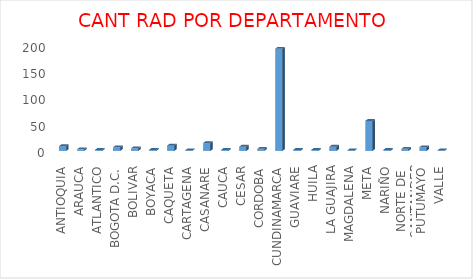
| Category | Series 0 |
|---|---|
| ANTIOQUIA | 9 |
| ARAUCA | 3 |
| ATLANTICO | 2 |
| BOGOTA D.C. | 7 |
| BOLIVAR | 5 |
| BOYACA | 2 |
| CAQUETA | 10 |
| CARTAGENA | 1 |
| CASANARE | 15 |
| CAUCA | 2 |
| CESAR | 8 |
| CORDOBA | 4 |
| CUNDINAMARCA | 194 |
| GUAVIARE | 2 |
| HUILA | 2 |
| LA GUAJIRA | 8 |
| MAGDALENA | 1 |
| META | 57 |
| NARIÑO | 2 |
| NORTE DE SANTANDER | 4 |
| PUTUMAYO | 7 |
| VALLE | 1 |